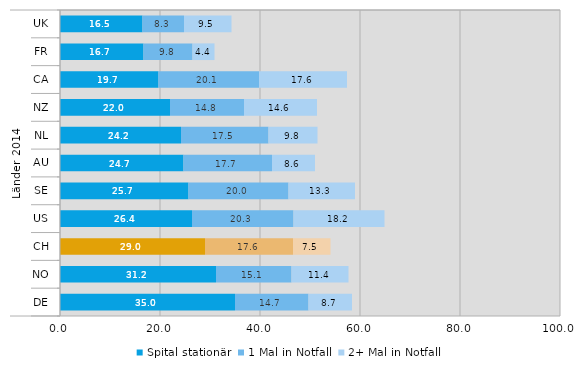
| Category | Spital stationär | 1 Mal in Notfall | 2+ Mal in Notfall |
|---|---|---|---|
| 0 | 16.5 | 8.3 | 9.5 |
| 1 | 16.7 | 9.8 | 4.4 |
| 2 | 19.7 | 20.1 | 17.6 |
| 3 | 22 | 14.8 | 14.6 |
| 4 | 24.2 | 17.5 | 9.8 |
| 5 | 24.7 | 17.7 | 8.6 |
| 6 | 25.7 | 20 | 13.3 |
| 7 | 26.4 | 20.3 | 18.2 |
| 8 | 29 | 17.6 | 7.5 |
| 9 | 31.2 | 15.1 | 11.4 |
| 10 | 35 | 14.7 | 8.7 |